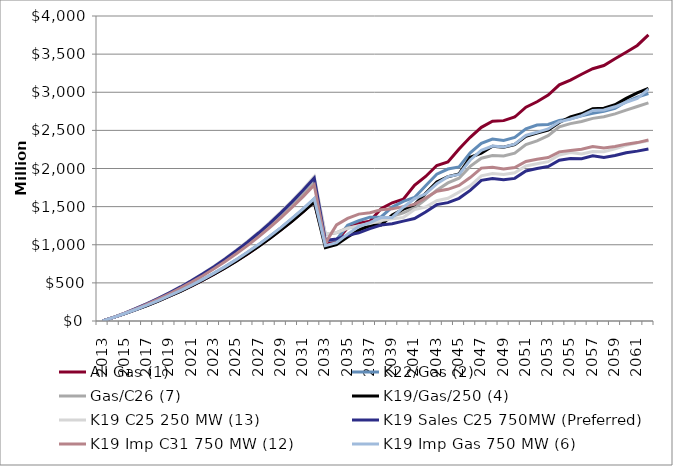
| Category | All Gas (1) | K22/Gas (2) | Gas/C26 (7) | K19/Gas/250 (4) | K19 C25 250 MW (13) | K19 Sales C25 750MW (Preferred) | K19 Imp C31 750 MW (12) | K19 Imp Gas 750 MW (6) |
|---|---|---|---|---|---|---|---|---|
| 2013.0 | 0 | 0 | 0 | 0 | 0 | 0 | 0 | 0 |
| 2014.0 | 47.63 | 47.63 | 47.63 | 47.63 | 47.63 | 47.63 | 47.63 | 47.63 |
| 2015.0 | 96.81 | 97.74 | 102.9 | 96.71 | 104.6 | 104.2 | 102.07 | 97.82 |
| 2016.0 | 148.92 | 150.88 | 161.7 | 148.72 | 165.27 | 164.43 | 159.96 | 151.05 |
| 2017.0 | 203.69 | 206.76 | 223.76 | 203.38 | 229.37 | 228.05 | 221.02 | 207.01 |
| 2018.0 | 262.57 | 266.88 | 290.72 | 262.14 | 298.61 | 296.75 | 286.86 | 267.23 |
| 2019.0 | 325.46 | 331.11 | 362.49 | 324.88 | 372.91 | 370.45 | 357.41 | 331.57 |
| 2020.0 | 390.2 | 397.29 | 436.74 | 389.48 | 449.86 | 446.76 | 430.34 | 397.87 |
| 2021.0 | 460.73 | 469.43 | 517.88 | 459.85 | 534.04 | 530.22 | 510.01 | 470.14 |
| 2022.0 | 535.12 | 545.55 | 603.81 | 534.07 | 623.27 | 618.68 | 594.33 | 546.41 |
| 2023.0 | 614.02 | 626.33 | 695.28 | 612.77 | 718.38 | 712.92 | 684.05 | 627.35 |
| 2024.0 | 697.84 | 712.21 | 792.84 | 696.38 | 819.91 | 813.51 | 779.69 | 713.4 |
| 2025.0 | 786.79 | 803.4 | 896.75 | 785.11 | 928.17 | 920.74 | 881.5 | 804.77 |
| 2026.0 | 880.26 | 899.28 | 1006.38 | 878.33 | 1042.51 | 1033.96 | 988.86 | 900.84 |
| 2027.0 | 978.75 | 1000.36 | 1122.34 | 976.56 | 1163.59 | 1153.82 | 1102.36 | 1002.14 |
| 2028.0 | 1083.38 | 1107.82 | 1245.99 | 1080.91 | 1292.82 | 1281.73 | 1223.32 | 1109.83 |
| 2029.0 | 1194.37 | 1221.85 | 1377.62 | 1191.59 | 1430.54 | 1418 | 1352.03 | 1224.11 |
| 2030.0 | 1311.35 | 1342.12 | 1516.91 | 1308.24 | 1576.41 | 1562.3 | 1488.15 | 1344.66 |
| 2031.0 | 1434.41 | 1468.71 | 1663.98 | 1430.94 | 1730.61 | 1714.81 | 1631.81 | 1471.54 |
| 2032.0 | 1564.06 | 1602.17 | 1819.54 | 1560.21 | 1893.88 | 1876.24 | 1783.67 | 1605.31 |
| 2033.0 | 999.12 | 1053.69 | 1137.32 | 961.26 | 1140.98 | 1057.31 | 1021.05 | 988.72 |
| 2034.0 | 1053.62 | 1065.12 | 1158.44 | 1002.63 | 1158.65 | 1075.83 | 1259.92 | 1026.87 |
| 2035.0 | 1223.17 | 1256.2 | 1220.27 | 1100.42 | 1214.41 | 1122.73 | 1345.61 | 1139.13 |
| 2036.0 | 1281.2 | 1314.79 | 1242.32 | 1191.77 | 1250.8 | 1156.57 | 1401.96 | 1240.23 |
| 2037.0 | 1308.92 | 1361.73 | 1255.68 | 1248.85 | 1277.45 | 1211.36 | 1420.69 | 1289.14 |
| 2038.0 | 1471.43 | 1365.13 | 1302.94 | 1257.44 | 1319.42 | 1259.56 | 1457.98 | 1356.9 |
| 2039.0 | 1550.53 | 1494.32 | 1371.42 | 1389.21 | 1339.37 | 1275.05 | 1470.57 | 1358.87 |
| 2040.0 | 1596.65 | 1568.09 | 1418.47 | 1466.43 | 1357.27 | 1309.84 | 1499.84 | 1492.4 |
| 2041.0 | 1779.24 | 1620.76 | 1483.69 | 1526.2 | 1461.7 | 1344.55 | 1529.45 | 1602.09 |
| 2042.0 | 1895.44 | 1773.48 | 1594.42 | 1673.67 | 1494.39 | 1430.18 | 1613.06 | 1667.9 |
| 2043.0 | 2039.38 | 1925.21 | 1716.35 | 1824.29 | 1577.02 | 1526.11 | 1703 | 1799.2 |
| 2044.0 | 2084.8 | 1993.11 | 1810.49 | 1892.46 | 1609.04 | 1552.68 | 1726.97 | 1893.3 |
| 2045.0 | 2256.67 | 2019.7 | 1872.43 | 1930.11 | 1690.8 | 1608.58 | 1777.87 | 1923 |
| 2046.0 | 2408.91 | 2205.95 | 2027.43 | 2146.53 | 1773.21 | 1712.34 | 1880.88 | 2111.9 |
| 2047.0 | 2539.72 | 2330.9 | 2135.48 | 2202.76 | 1904.51 | 1844.35 | 2005.12 | 2237.68 |
| 2048.0 | 2619.58 | 2385.99 | 2171.38 | 2292.58 | 1933.06 | 1867.73 | 2017.03 | 2294.5 |
| 2049.0 | 2627.78 | 2368.76 | 2163.39 | 2278.23 | 1919.99 | 1852.24 | 1993.81 | 2280.62 |
| 2050.0 | 2675.1 | 2406.57 | 2202.08 | 2314.55 | 1943.28 | 1870.52 | 2013.77 | 2319.09 |
| 2051.0 | 2804.36 | 2520.6 | 2313.96 | 2423.12 | 2032.73 | 1967.52 | 2092.95 | 2433.74 |
| 2052.0 | 2874.93 | 2569.99 | 2362.76 | 2463.59 | 2061.69 | 2000.91 | 2120.4 | 2474.6 |
| 2053.0 | 2962.79 | 2577.56 | 2431.14 | 2502.23 | 2089.17 | 2026.8 | 2143.95 | 2519.03 |
| 2054.0 | 3096.42 | 2630.06 | 2547.28 | 2603.07 | 2177.97 | 2107.71 | 2217.98 | 2612.47 |
| 2055.0 | 3158.44 | 2653.39 | 2588.89 | 2677.84 | 2208.89 | 2131.04 | 2237.12 | 2648.76 |
| 2056.0 | 3235.66 | 2690.18 | 2615.89 | 2717.11 | 2189.41 | 2127.81 | 2253.11 | 2693.63 |
| 2057.0 | 3308.18 | 2722.9 | 2657.63 | 2783.44 | 2223.36 | 2165.43 | 2287.66 | 2761.19 |
| 2058.0 | 3350.49 | 2749.78 | 2679.2 | 2789.61 | 2220.5 | 2144.33 | 2268.71 | 2767.08 |
| 2059.0 | 3439.5 | 2789.91 | 2717.02 | 2835.73 | 2257.66 | 2169.62 | 2288.25 | 2809.58 |
| 2060.0 | 3524.7 | 2874.43 | 2765.1 | 2919.76 | 2303.96 | 2207.15 | 2319.44 | 2868.91 |
| 2061.0 | 3613.8 | 2936.23 | 2812.88 | 2991.12 | 2335.91 | 2227.87 | 2339.6 | 2917.64 |
| 2062.0 | 3753.52 | 2983.52 | 2860.38 | 3049.63 | 2363.45 | 2255.8 | 2372.64 | 3041.54 |